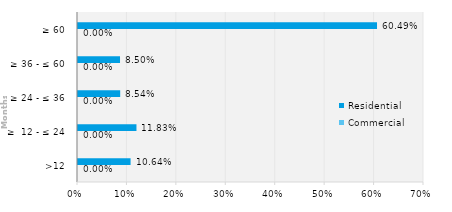
| Category | Commercial | Residential |
|---|---|---|
| >12 | 0 | 0.106 |
| ≥  12 - ≤ 24 | 0 | 0.118 |
| ≥ 24 - ≤ 36 | 0 | 0.085 |
| ≥ 36 - ≤ 60 | 0 | 0.085 |
| ≥ 60 | 0 | 0.605 |